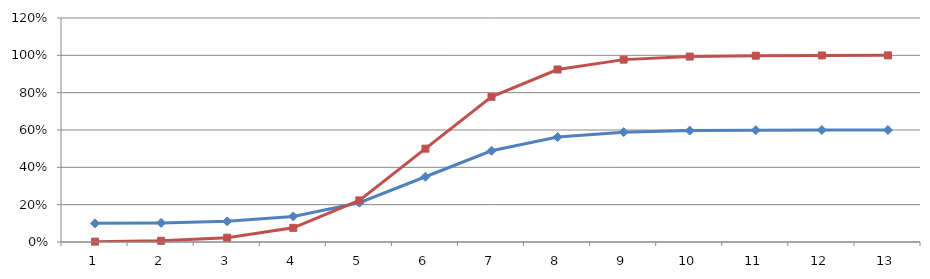
| Category | Series 0 | Curva Base |
|---|---|---|
| 1.0 | 0.1 | 0.002 |
| 2.0 | 0.102 | 0.007 |
| 3.0 | 0.111 | 0.023 |
| 4.0 | 0.137 | 0.076 |
| 5.0 | 0.211 | 0.223 |
| 6.0 | 0.35 | 0.5 |
| 7.0 | 0.488 | 0.777 |
| 8.0 | 0.562 | 0.924 |
| 9.0 | 0.589 | 0.977 |
| 10.0 | 0.597 | 0.993 |
| 11.0 | 0.599 | 0.998 |
| 12.0 | 0.6 | 0.999 |
| 13.0 | 0.6 | 1 |